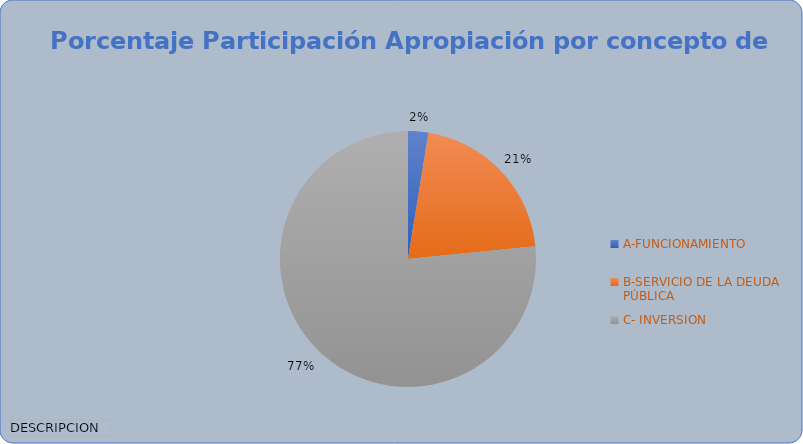
| Category | Total |
|---|---|
| A-FUNCIONAMIENTO | 74780.665 |
| B-SERVICIO DE LA DEUDA PÚBLICA | 608283.882 |
| C- INVERSION | 2233693.029 |